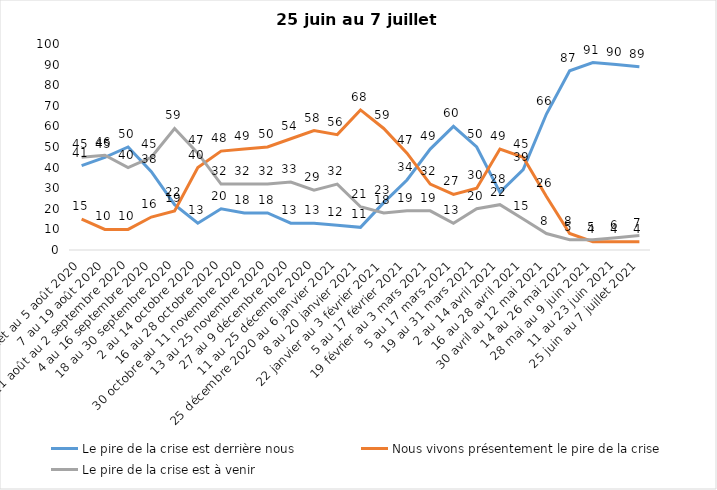
| Category | Le pire de la crise est derrière nous | Nous vivons présentement le pire de la crise | Le pire de la crise est à venir |
|---|---|---|---|
| 24 juillet au 5 août 2020 | 41 | 15 | 45 |
| 7 au 19 août 2020 | 45 | 10 | 46 |
| 21 août au 2 septembre 2020 | 50 | 10 | 40 |
| 4 au 16 septembre 2020 | 38 | 16 | 45 |
| 18 au 30 septembre 2020 | 22 | 19 | 59 |
| 2 au 14 octobre 2020 | 13 | 40 | 47 |
| 16 au 28 octobre 2020 | 20 | 48 | 32 |
| 30 octobre au 11 novembre 2020 | 18 | 49 | 32 |
| 13 au 25 novembre 2020 | 18 | 50 | 32 |
| 27 au 9 décembre 2020 | 13 | 54 | 33 |
| 11 au 25 décembre 2020 | 13 | 58 | 29 |
| 25 décembre 2020 au 6 janvier 2021 | 12 | 56 | 32 |
| 8 au 20 janvier 2021 | 11 | 68 | 21 |
| 22 janvier au 3 février 2021 | 23 | 59 | 18 |
| 5 au 17 février 2021 | 34 | 47 | 19 |
| 19 février au 3 mars 2021 | 49 | 32 | 19 |
| 5 au 17 mars 2021 | 60 | 27 | 13 |
| 19 au 31 mars 2021 | 50 | 30 | 20 |
| 2 au 14 avril 2021 | 28 | 49 | 22 |
| 16 au 28 avril 2021 | 39 | 45 | 15 |
| 30 avril au 12 mai 2021 | 66 | 26 | 8 |
| 14 au 26 mai 2021 | 87 | 8 | 5 |
| 28 mai au 9 juin 2021 | 91 | 4 | 5 |
| 11 au 23 juin 2021 | 90 | 4 | 6 |
| 25 juin au 7 juillet 2021 | 89 | 4 | 7 |